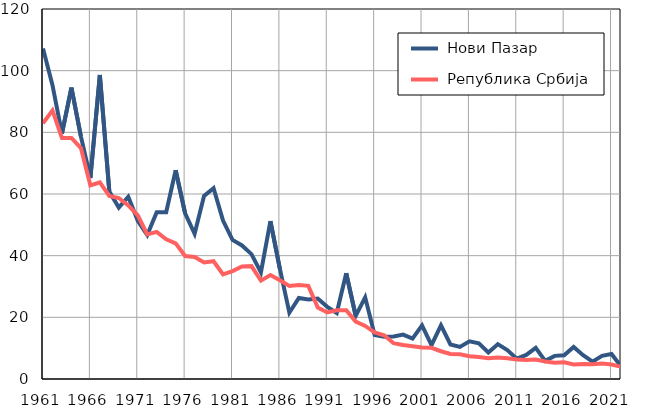
| Category |  Нови Пазар |  Република Србија |
|---|---|---|
| 1961.0 | 107.2 | 82.9 |
| 1962.0 | 95.3 | 87.1 |
| 1963.0 | 79.6 | 78.2 |
| 1964.0 | 94.5 | 78.2 |
| 1965.0 | 78.7 | 74.9 |
| 1966.0 | 65.2 | 62.8 |
| 1967.0 | 98.6 | 63.8 |
| 1968.0 | 60.8 | 59.4 |
| 1969.0 | 55.6 | 58.7 |
| 1970.0 | 59.1 | 56.3 |
| 1971.0 | 51.3 | 53.1 |
| 1972.0 | 46.7 | 46.9 |
| 1973.0 | 54.1 | 47.7 |
| 1974.0 | 54.1 | 45.3 |
| 1975.0 | 67.7 | 44 |
| 1976.0 | 53.7 | 39.9 |
| 1977.0 | 47.1 | 39.6 |
| 1978.0 | 59.4 | 37.8 |
| 1979.0 | 61.9 | 38.2 |
| 1980.0 | 51.4 | 33.9 |
| 1981.0 | 45.1 | 35 |
| 1982.0 | 43.3 | 36.5 |
| 1983.0 | 40.5 | 36.6 |
| 1984.0 | 34.6 | 31.9 |
| 1985.0 | 51.2 | 33.7 |
| 1986.0 | 35.7 | 32 |
| 1987.0 | 21.5 | 30.2 |
| 1988.0 | 26.3 | 30.5 |
| 1989.0 | 25.8 | 30.2 |
| 1990.0 | 26.1 | 23.2 |
| 1991.0 | 23.4 | 21.6 |
| 1992.0 | 21.4 | 22.3 |
| 1993.0 | 34.3 | 22.3 |
| 1994.0 | 20.5 | 18.6 |
| 1995.0 | 26.5 | 17.2 |
| 1996.0 | 14.3 | 15.1 |
| 1997.0 | 13.7 | 14.2 |
| 1998.0 | 13.8 | 11.6 |
| 1999.0 | 14.4 | 11 |
| 2000.0 | 13.1 | 10.6 |
| 2001.0 | 17.4 | 10.2 |
| 2002.0 | 11 | 10.1 |
| 2003.0 | 17.4 | 9 |
| 2004.0 | 11.2 | 8.1 |
| 2005.0 | 10.4 | 8 |
| 2006.0 | 12.2 | 7.4 |
| 2007.0 | 11.6 | 7.1 |
| 2008.0 | 8.6 | 6.7 |
| 2009.0 | 11.3 | 7 |
| 2010.0 | 9.4 | 6.7 |
| 2011.0 | 6.6 | 6.3 |
| 2012.0 | 7.8 | 6.2 |
| 2013.0 | 10.1 | 6.3 |
| 2014.0 | 5.9 | 5.7 |
| 2015.0 | 7.5 | 5.3 |
| 2016.0 | 7.7 | 5.4 |
| 2017.0 | 10.4 | 4.7 |
| 2018.0 | 7.7 | 4.9 |
| 2019.0 | 5.6 | 4.8 |
| 2020.0 | 7.5 | 5 |
| 2021.0 | 8.1 | 4.7 |
| 2022.0 | 4.1 | 4 |